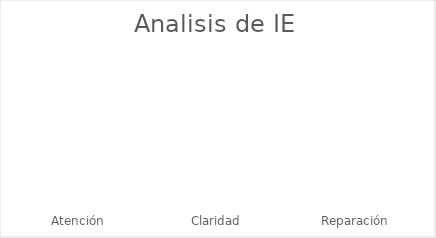
| Category | Series 0 |
|---|---|
| Atención | 0 |
| Claridad | 0 |
| Reparación | 0 |